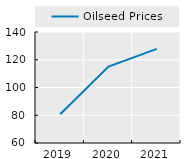
| Category | Oilseed Prices |
|---|---|
| 2019.0 | 80.709 |
| 2020.0 | 115.06 |
| 2021.0 | 127.809 |